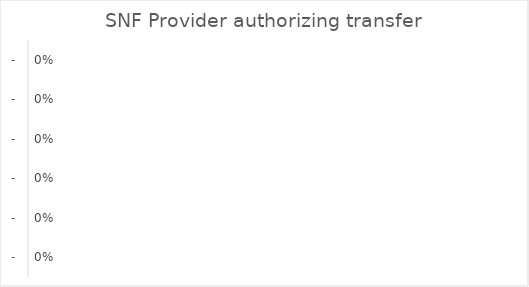
| Category | Series 0 |
|---|---|
| - | 0 |
| - | 0 |
| - | 0 |
| - | 0 |
| - | 0 |
| - | 0 |